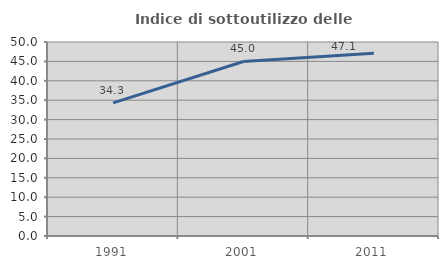
| Category | Indice di sottoutilizzo delle abitazioni  |
|---|---|
| 1991.0 | 34.326 |
| 2001.0 | 44.978 |
| 2011.0 | 47.106 |